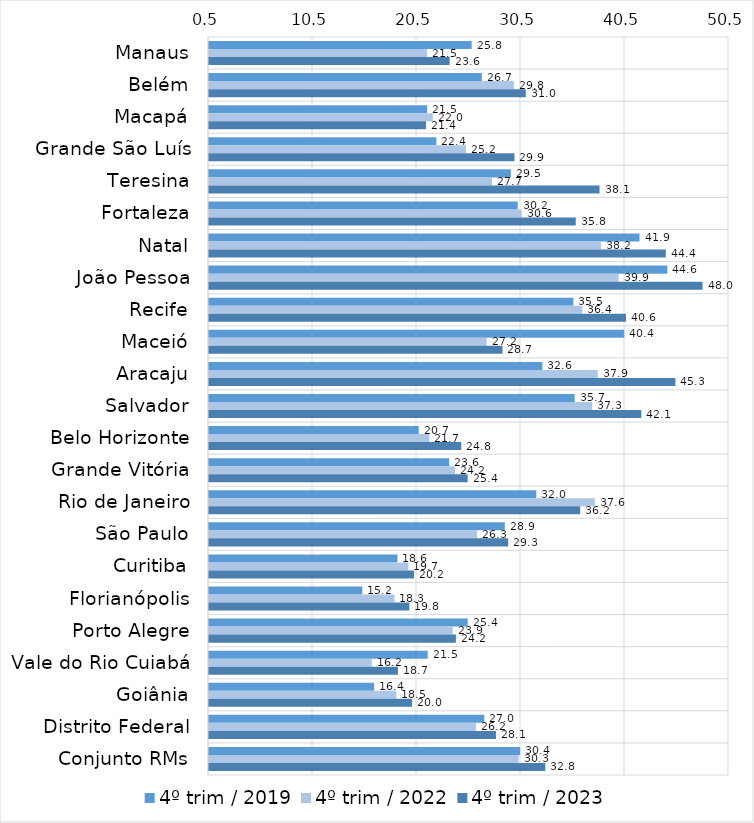
| Category | 4º trim / 2019 | 4º trim / 2022 | 4º trim / 2023 |
|---|---|---|---|
| Manaus | 25.754 | 21.471 | 23.641 |
| Belém | 26.733 | 29.821 | 30.961 |
| Macapá | 21.476 | 22.024 | 21.372 |
| Grande São Luís | 22.361 | 25.213 | 29.871 |
| Teresina | 29.527 | 27.712 | 38.052 |
| Fortaleza | 30.187 | 30.577 | 35.766 |
| Natal | 41.895 | 38.184 | 44.425 |
| João Pessoa | 44.576 | 39.887 | 47.956 |
| Recife | 35.531 | 36.386 | 40.596 |
| Maceió | 40.433 | 27.196 | 28.717 |
| Aracaju | 32.555 | 37.879 | 45.341 |
| Salvador | 35.659 | 37.341 | 42.07 |
| Belo Horizonte | 20.668 | 21.681 | 24.756 |
| Grande Vitória | 23.593 | 24.157 | 25.374 |
| Rio de Janeiro | 31.973 | 37.606 | 36.188 |
| São Paulo | 28.941 | 26.272 | 29.268 |
| Curitiba | 18.619 | 19.672 | 20.221 |
| Florianópolis | 15.24 | 18.335 | 19.762 |
| Porto Alegre | 25.377 | 23.931 | 24.242 |
| Vale do Rio Cuiabá | 21.532 | 16.157 | 18.669 |
| Goiânia | 16.389 | 18.519 | 20.032 |
| Distrito Federal | 26.969 | 26.16 | 28.093 |
| Conjunto RMs | 30.416 | 30.274 | 32.839 |